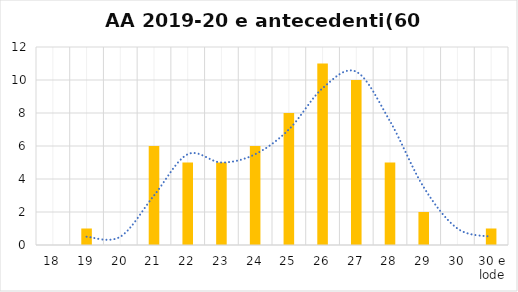
| Category | Series 0 |
|---|---|
| 18 | 0 |
| 19 | 1 |
| 20 | 0 |
| 21 | 6 |
| 22 | 5 |
| 23 | 5 |
| 24 | 6 |
| 25 | 8 |
| 26 | 11 |
| 27 | 10 |
| 28 | 5 |
| 29 | 2 |
| 30 | 0 |
| 30 e lode | 1 |